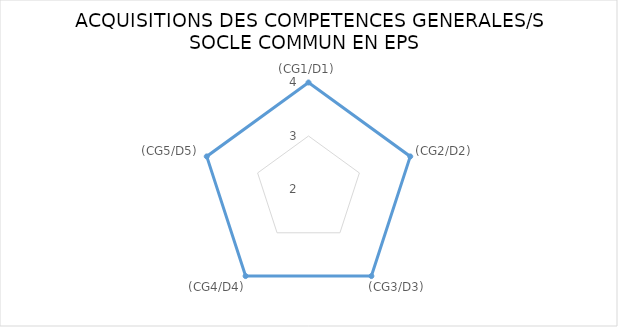
| Category | Series 0 | "" | 1 | 2 | 3 | 4 |
|---|---|---|---|---|---|---|
| (CG1/D1) | 4 |  |  |  |  |  |
| (CG2/D2) | 4 |  |  |  |  |  |
| (CG3/D3) | 4 |  |  |  |  |  |
| (CG4/D4) | 4 |  |  |  |  |  |
| (CG5/D5) | 4 |  |  |  |  |  |